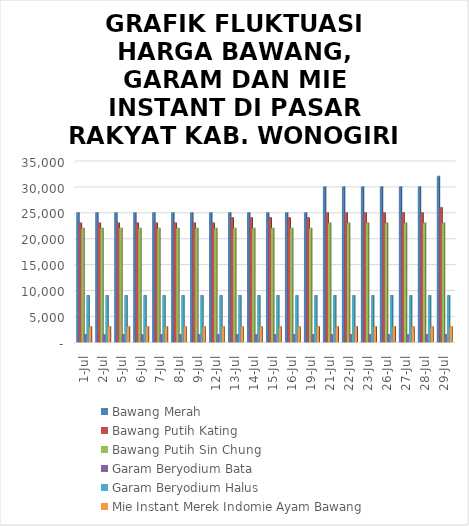
| Category | Bawang Merah  | Bawang Putih Kating | Bawang Putih Sin Chung | Garam Beryodium Bata | Garam Beryodium Halus | Mie Instant Merek Indomie Ayam Bawang |
|---|---|---|---|---|---|---|
| 2021-07-01 | 25000 | 23000 | 22000 | 1500 | 9000 | 3000 |
| 2021-07-02 | 25000 | 23000 | 22000 | 1500 | 9000 | 3000 |
| 2021-07-05 | 25000 | 23000 | 22000 | 1500 | 9000 | 3000 |
| 2021-07-06 | 25000 | 23000 | 22000 | 1500 | 9000 | 3000 |
| 2021-07-07 | 25000 | 23000 | 22000 | 1500 | 9000 | 3000 |
| 2021-07-08 | 25000 | 23000 | 22000 | 1500 | 9000 | 3000 |
| 2021-07-09 | 25000 | 23000 | 22000 | 1500 | 9000 | 3000 |
| 2021-07-12 | 25000 | 23000 | 22000 | 1500 | 9000 | 3000 |
| 2021-07-13 | 25000 | 24000 | 22000 | 1500 | 9000 | 3000 |
| 2021-07-14 | 25000 | 24000 | 22000 | 1500 | 9000 | 3000 |
| 2021-07-15 | 25000 | 24000 | 22000 | 1500 | 9000 | 3000 |
| 2021-07-16 | 25000 | 24000 | 22000 | 1500 | 9000 | 3000 |
| 2021-07-19 | 25000 | 24000 | 22000 | 1500 | 9000 | 3000 |
| 2021-07-21 | 30000 | 25000 | 23000 | 1500 | 9000 | 3000 |
| 2021-07-22 | 30000 | 25000 | 23000 | 1500 | 9000 | 3000 |
| 2021-07-23 | 30000 | 25000 | 23000 | 1500 | 9000 | 3000 |
| 2021-07-26 | 30000 | 25000 | 23000 | 1500 | 9000 | 3000 |
| 2021-07-27 | 30000 | 25000 | 23000 | 1500 | 9000 | 3000 |
| 2021-07-28 | 30000 | 25000 | 23000 | 1500 | 9000 | 3000 |
| 2021-07-29 | 32000 | 26000 | 23000 | 1500 | 9000 | 3000 |